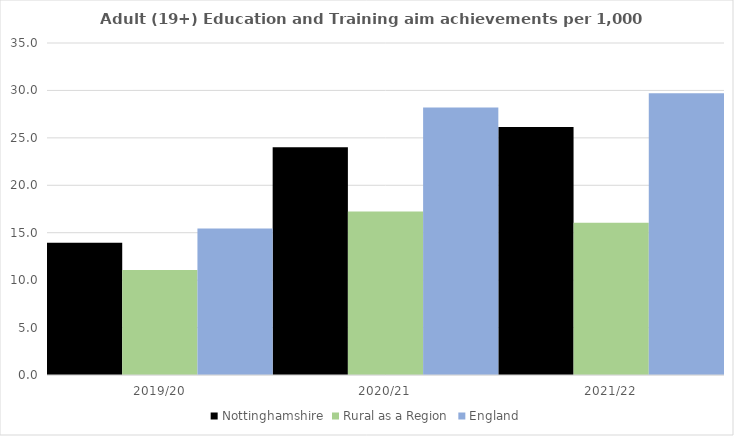
| Category | Nottinghamshire | Rural as a Region | England |
|---|---|---|---|
| 2019/20 | 13.952 | 11.081 | 15.446 |
| 2020/21 | 24.019 | 17.224 | 28.211 |
| 2021/22 | 26.133 | 16.063 | 29.711 |